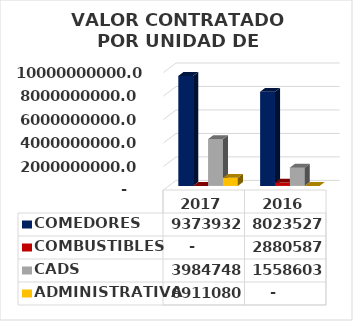
| Category | COMEDORES | COMBUSTIBLES | CADS | ADMINISTRATIVA |
|---|---|---|---|---|
| 2017.0 | 9373932908 | 0 | 3984748755 | 691108048 |